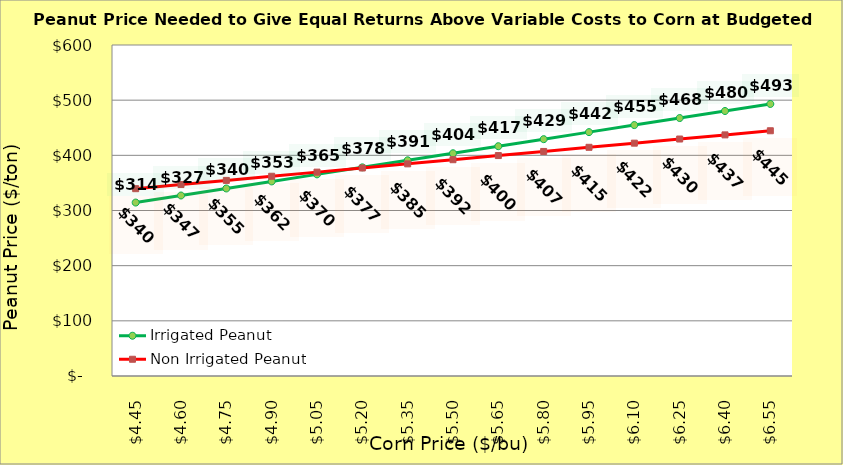
| Category | Irrigated Peanut | Non Irrigated Peanut |
|---|---|---|
| 4.4499999999999975 | 314.411 | 339.56 |
| 4.599999999999998 | 327.177 | 347.06 |
| 4.749999999999998 | 339.943 | 354.56 |
| 4.899999999999999 | 352.709 | 362.06 |
| 5.049999999999999 | 365.475 | 369.56 |
| 5.199999999999999 | 378.241 | 377.06 |
| 5.35 | 391.007 | 384.56 |
| 5.5 | 403.773 | 392.06 |
| 5.65 | 416.538 | 399.56 |
| 5.800000000000001 | 429.304 | 407.06 |
| 5.950000000000001 | 442.07 | 414.56 |
| 6.100000000000001 | 454.836 | 422.06 |
| 6.250000000000002 | 467.602 | 429.56 |
| 6.400000000000002 | 480.368 | 437.06 |
| 6.5500000000000025 | 493.134 | 444.56 |